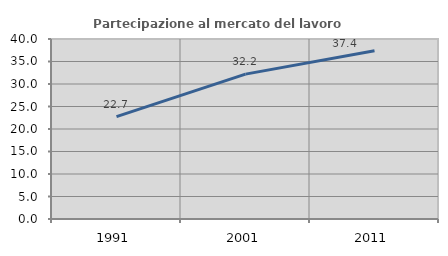
| Category | Partecipazione al mercato del lavoro  femminile |
|---|---|
| 1991.0 | 22.733 |
| 2001.0 | 32.193 |
| 2011.0 | 37.374 |